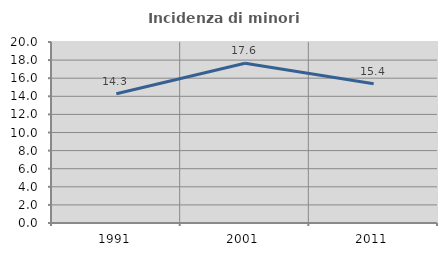
| Category | Incidenza di minori stranieri |
|---|---|
| 1991.0 | 14.286 |
| 2001.0 | 17.647 |
| 2011.0 | 15.385 |